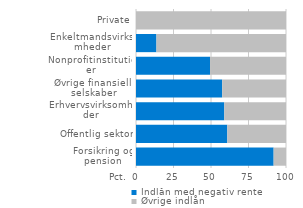
| Category | Indlån med negativ rente | Øvrige indlån |
|---|---|---|
| Forsikring og pension | 91.758 | 8.242 |
| Offentlig sektor | 60.879 | 39.121 |
| Erhvervsvirksomheder | 58.863 | 41.137 |
| Øvrige finansielle selskaber | 57.463 | 42.537 |
| Nonprofitinstitutioner | 49.378 | 50.622 |
| Enkeltmandsvirksomheder | 13.638 | 86.362 |
| Private | 0 | 100 |